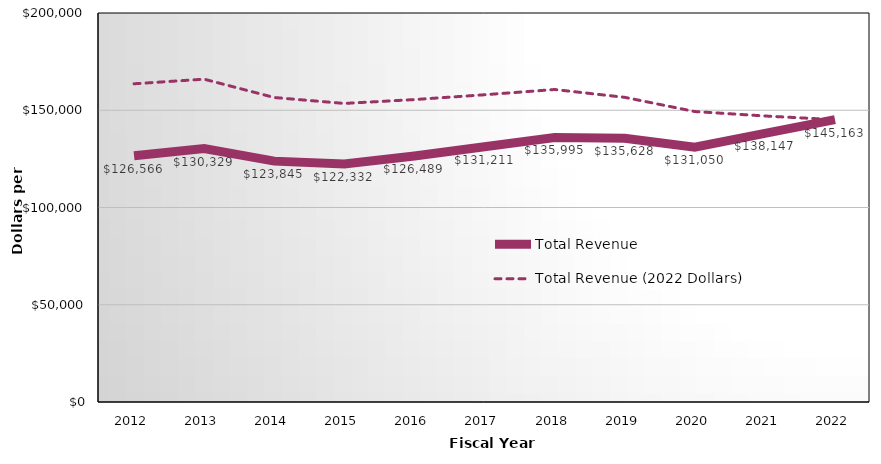
| Category | Total Revenue | Total Revenue (2022 Dollars) |
|---|---|---|
| 2012.0 | 126566 | 163613.223 |
| 2013.0 | 130329 | 165975.743 |
| 2014.0 | 123845 | 156552.958 |
| 2015.0 | 122332 | 153502.975 |
| 2016.0 | 126489 | 155493.055 |
| 2017.0 | 131211 | 157961.492 |
| 2018.0 | 135995 | 160665.66 |
| 2019.0 | 135628 | 156644.801 |
| 2020.0 | 131050 | 149337.503 |
| 2021.0 | 138147 | 147049.668 |
| 2022.0 | 145163 | 145163 |